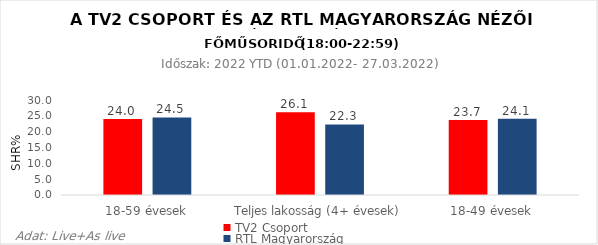
| Category | TV2 Csoport | RTL Magyarország |
|---|---|---|
| 18-59 évesek | 24 | 24.5 |
| Teljes lakosság (4+ évesek) | 26.1 | 22.3 |
| 18-49 évesek | 23.7 | 24.1 |